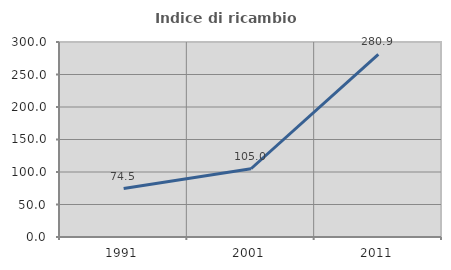
| Category | Indice di ricambio occupazionale  |
|---|---|
| 1991.0 | 74.549 |
| 2001.0 | 105 |
| 2011.0 | 280.851 |